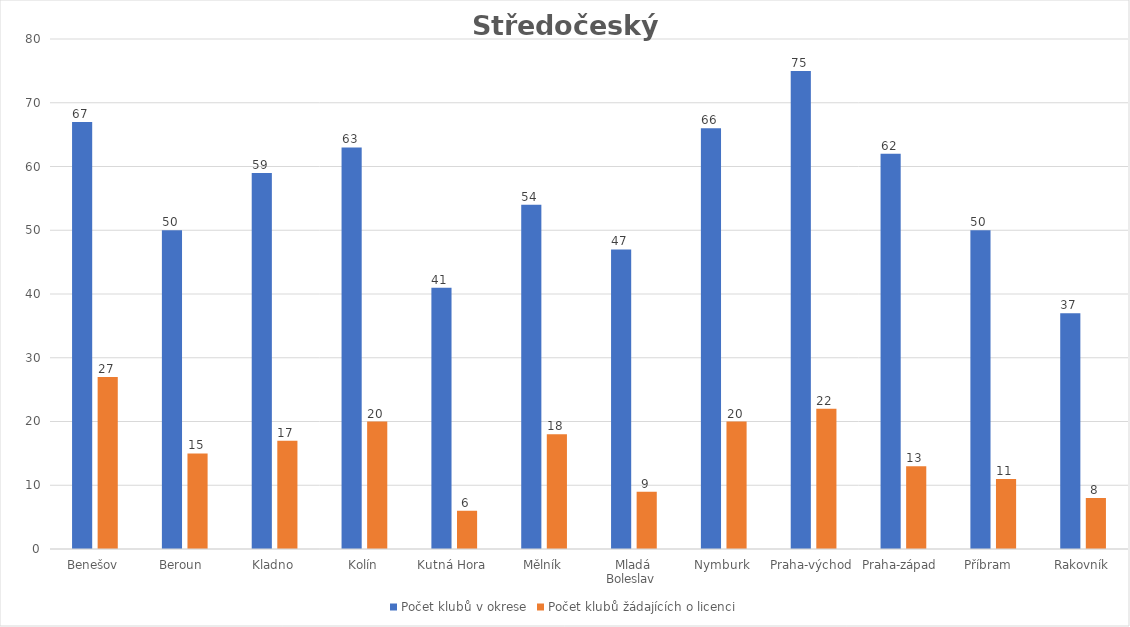
| Category | Počet klubů v okrese | Počet klubů žádajících o licenci |
|---|---|---|
| Benešov | 67 | 27 |
| Beroun  | 50 | 15 |
| Kladno | 59 | 17 |
| Kolín | 63 | 20 |
| Kutná Hora  | 41 | 6 |
| Mělník | 54 | 18 |
| Mladá Boleslav  | 47 | 9 |
| Nymburk | 66 | 20 |
| Praha-východ | 75 | 22 |
| Praha-západ  | 62 | 13 |
| Příbram   | 50 | 11 |
| Rakovník | 37 | 8 |